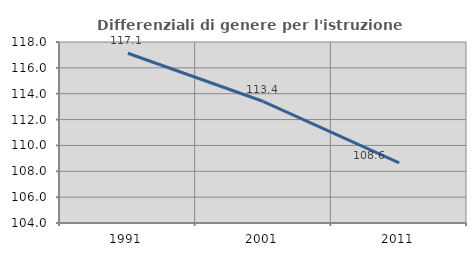
| Category | Differenziali di genere per l'istruzione superiore |
|---|---|
| 1991.0 | 117.131 |
| 2001.0 | 113.395 |
| 2011.0 | 108.642 |